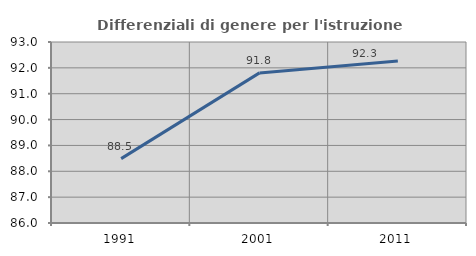
| Category | Differenziali di genere per l'istruzione superiore |
|---|---|
| 1991.0 | 88.489 |
| 2001.0 | 91.806 |
| 2011.0 | 92.267 |